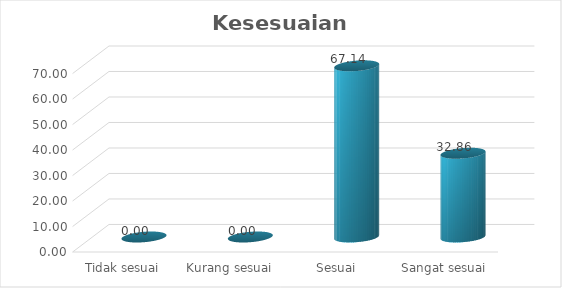
| Category | Kesesuaian Pelayanan |
|---|---|
| Tidak sesuai  | 0 |
| Kurang sesuai  | 0 |
| Sesuai | 67.143 |
| Sangat sesuai | 32.857 |